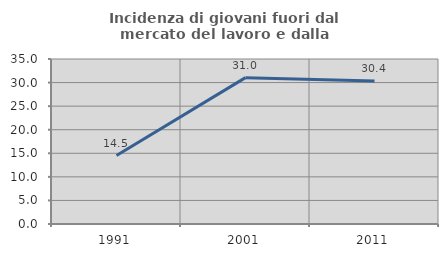
| Category | Incidenza di giovani fuori dal mercato del lavoro e dalla formazione  |
|---|---|
| 1991.0 | 14.526 |
| 2001.0 | 31.042 |
| 2011.0 | 30.353 |